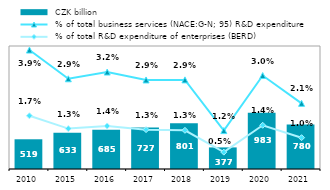
| Category |  CZK billion |
|---|---|
| 2010.0 | 519.388 |
| 2015.0 | 632.822 |
| 2016.0 | 685.294 |
| 2017.0 | 727.041 |
| 2018.0 | 800.583 |
| 2019.0 | 377.268 |
| 2020.0 | 982.945 |
| 2021.0 | 779.652 |